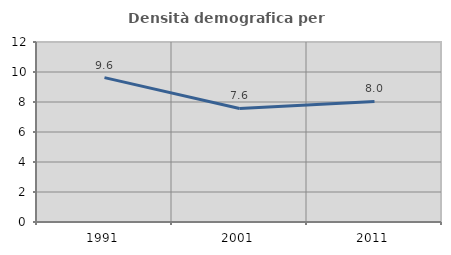
| Category | Densità demografica |
|---|---|
| 1991.0 | 9.624 |
| 2001.0 | 7.568 |
| 2011.0 | 8.035 |